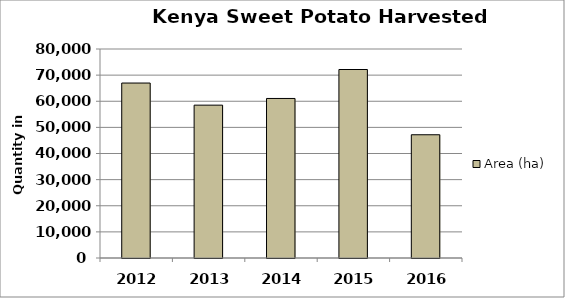
| Category | Area (ha) |
|---|---|
| 2012.0 | 66971 |
| 2013.0 | 58509 |
| 2014.0 | 61067 |
| 2015.0 | 72151 |
| 2016.0 | 47177 |